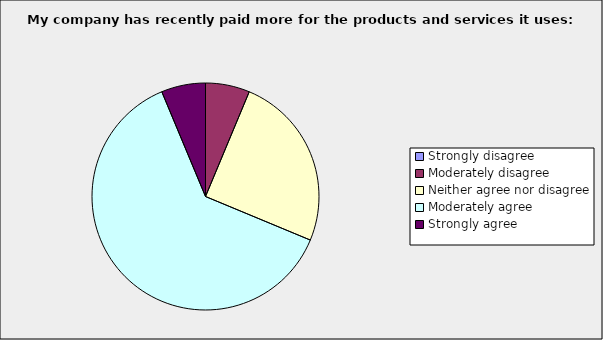
| Category | Series 0 |
|---|---|
| Strongly disagree | 0 |
| Moderately disagree | 0.063 |
| Neither agree nor disagree | 0.25 |
| Moderately agree | 0.625 |
| Strongly agree | 0.063 |